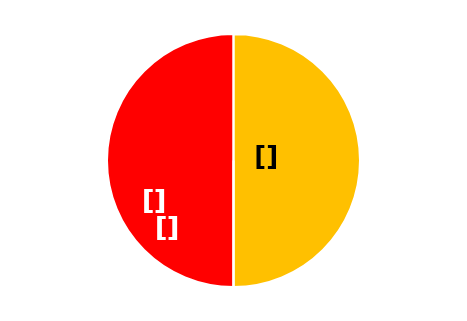
| Category | Series 0 |
|---|---|
| 0 | 30 |
| 1 | 0 |
| 2 | 30 |